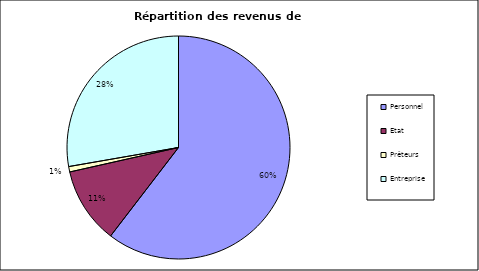
| Category | Series 0 | Series 1 |
|---|---|---|
| Personnel | 5416946 | 0.604 |
| Etat | 991296 | 0.111 |
| Prêteurs | 70357 | 0.008 |
| Entreprise | 2487123 | 0.277 |